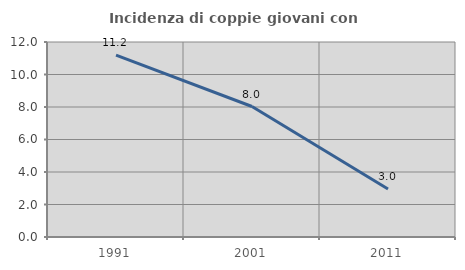
| Category | Incidenza di coppie giovani con figli |
|---|---|
| 1991.0 | 11.186 |
| 2001.0 | 8.029 |
| 2011.0 | 2.952 |